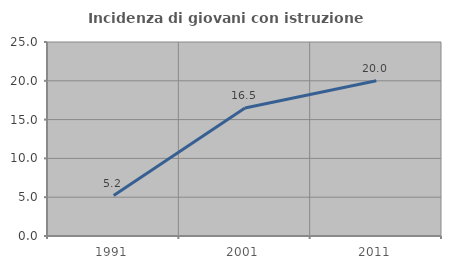
| Category | Incidenza di giovani con istruzione universitaria |
|---|---|
| 1991.0 | 5.208 |
| 2001.0 | 16.495 |
| 2011.0 | 20 |